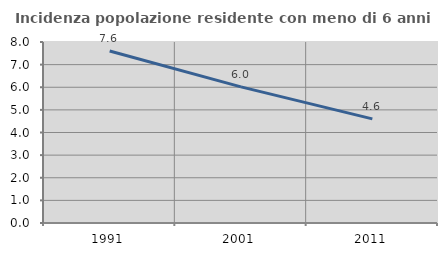
| Category | Incidenza popolazione residente con meno di 6 anni |
|---|---|
| 1991.0 | 7.605 |
| 2001.0 | 6.018 |
| 2011.0 | 4.601 |